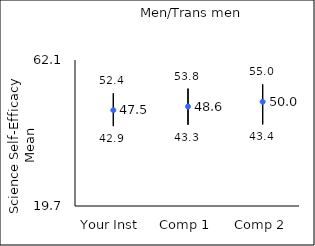
| Category | 25th percentile | 75th percentile | Mean |
|---|---|---|---|
| Your Inst | 42.9 | 52.4 | 47.52 |
| Comp 1 | 43.3 | 53.8 | 48.58 |
| Comp 2 | 43.4 | 55 | 49.97 |